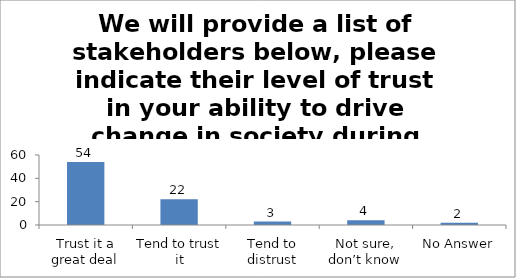
| Category | We will provide a list of stakeholders below, please indicate their level of trust in your ability to drive change in society during studies. (Teachers) |
|---|---|
| Trust it a great deal | 54 |
| Tend to trust it | 22 |
| Tend to distrust | 3 |
| Not sure, don’t know | 4 |
| No Answer | 2 |